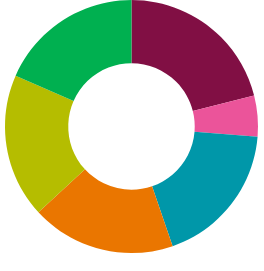
| Category | Series 0 |
|---|---|
| Space heating (gas £ per year) | 0 |
| Hot water (gas £ per year) | 0 |
| Space heating (DH £ per year) | 111944.88 |
| Hot water (DH £ per year) | 27986.22 |
| Space heating (electricity £ per year) | 0 |
| Hot water (electricity £ per year) | 0 |
| Cooling (£ per year) | 98005.028 |
| Lighting (£ per year) | 98005.028 |
| Auxiliary - fans and pumps (£ per year)) | 98005.028 |
| Equipment /small power (£ per year) | 98005.028 |